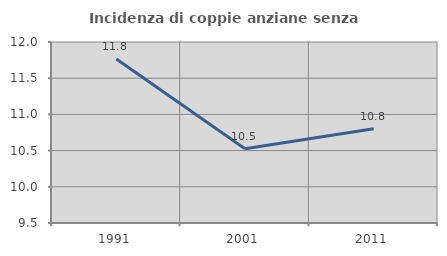
| Category | Incidenza di coppie anziane senza figli  |
|---|---|
| 1991.0 | 11.765 |
| 2001.0 | 10.526 |
| 2011.0 | 10.801 |